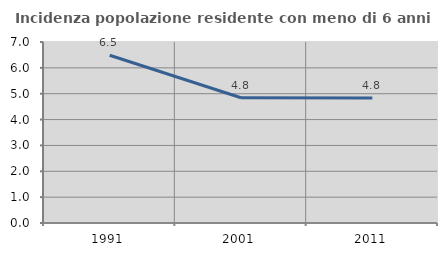
| Category | Incidenza popolazione residente con meno di 6 anni |
|---|---|
| 1991.0 | 6.489 |
| 2001.0 | 4.843 |
| 2011.0 | 4.832 |